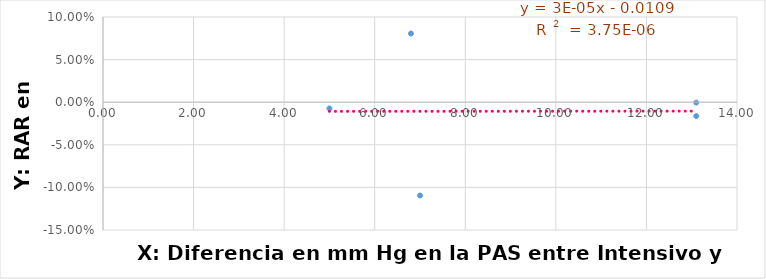
| Category | Y = RAR en EnfRenTerm |
|---|---|
| 7.0 | -0.11 |
| 6.8 | 0.081 |
| 5.0 | -0.007 |
| 13.1 | 0 |
| 13.1 | -0.016 |